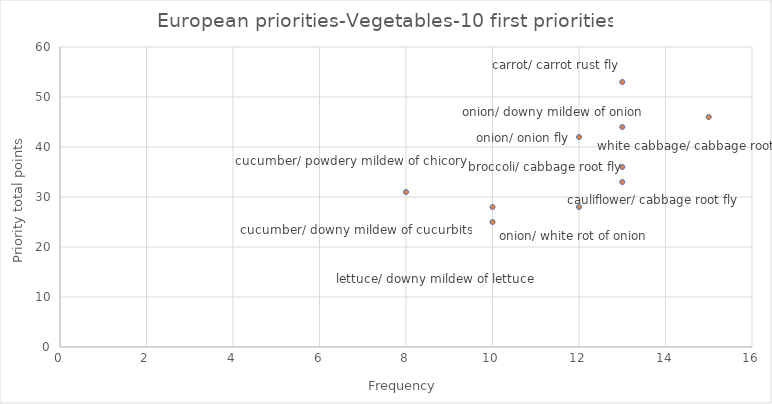
| Category | Priority total points |
|---|---|
| 13.0 | 53 |
| 15.0 | 46 |
| 13.0 | 44 |
| 12.0 | 42 |
| 13.0 | 36 |
| 13.0 | 33 |
| 8.0 | 31 |
| 10.0 | 28 |
| 12.0 | 28 |
| 10.0 | 25 |